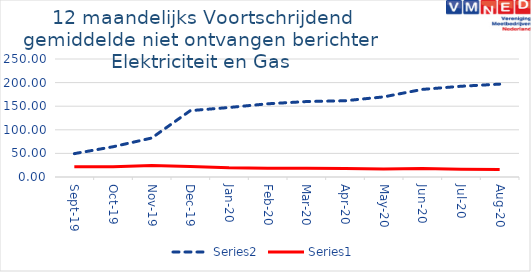
| Category | Series 3 | Series 0 |
|---|---|---|
| 2019-09-01 | 49.5 | 21.667 |
| 2019-10-01 | 64.083 | 21.917 |
| 2019-11-01 | 82.583 | 24.333 |
| 2019-12-01 | 140.583 | 22.333 |
| 2020-01-01 | 147.25 | 19.5 |
| 2020-02-01 | 155.083 | 18.667 |
| 2020-03-01 | 159.833 | 18.667 |
| 2020-04-01 | 161.5 | 17.75 |
| 2020-05-01 | 169.75 | 16.75 |
| 2020-06-01 | 185.583 | 17.75 |
| 2020-07-01 | 192.25 | 16.25 |
| 2020-08-01 | 196.75 | 15.833 |